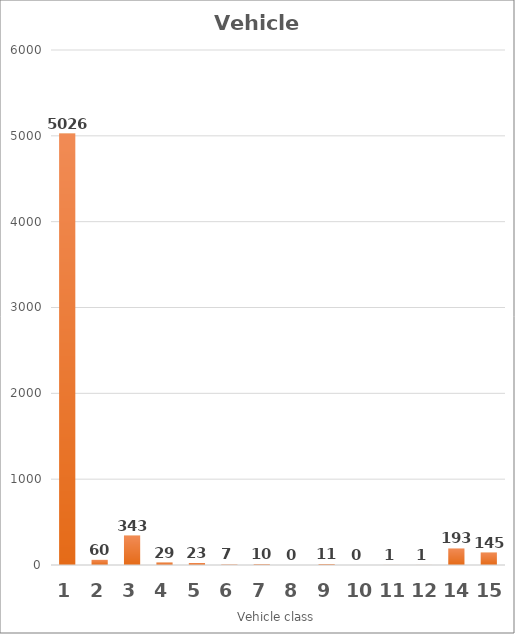
| Category | Series 0 |
|---|---|
| 1.0 | 5026 |
| 2.0 | 60 |
| 3.0 | 343 |
| 4.0 | 29 |
| 5.0 | 23 |
| 6.0 | 7 |
| 7.0 | 10 |
| 8.0 | 0 |
| 9.0 | 11 |
| 10.0 | 0 |
| 11.0 | 1 |
| 12.0 | 1 |
| 14.0 | 193 |
| 15.0 | 145 |